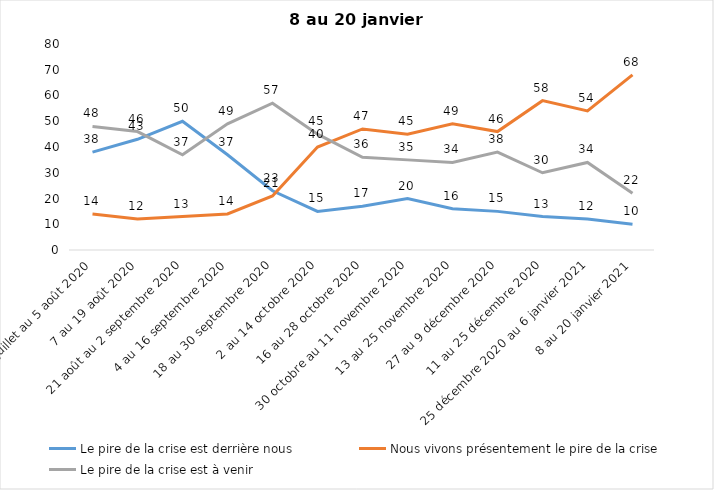
| Category | Le pire de la crise est derrière nous | Nous vivons présentement le pire de la crise | Le pire de la crise est à venir |
|---|---|---|---|
| 24 juillet au 5 août 2020 | 38 | 14 | 48 |
| 7 au 19 août 2020 | 43 | 12 | 46 |
| 21 août au 2 septembre 2020 | 50 | 13 | 37 |
| 4 au 16 septembre 2020 | 37 | 14 | 49 |
| 18 au 30 septembre 2020 | 23 | 21 | 57 |
| 2 au 14 octobre 2020 | 15 | 40 | 45 |
| 16 au 28 octobre 2020 | 17 | 47 | 36 |
| 30 octobre au 11 novembre 2020 | 20 | 45 | 35 |
| 13 au 25 novembre 2020 | 16 | 49 | 34 |
| 27 au 9 décembre 2020 | 15 | 46 | 38 |
| 11 au 25 décembre 2020 | 13 | 58 | 30 |
| 25 décembre 2020 au 6 janvier 2021 | 12 | 54 | 34 |
| 8 au 20 janvier 2021 | 10 | 68 | 22 |